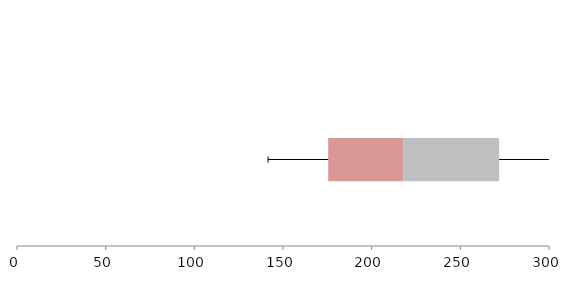
| Category | Series 1 | Series 2 | Series 3 |
|---|---|---|---|
| 0 | 175.494 | 42.316 | 54.063 |